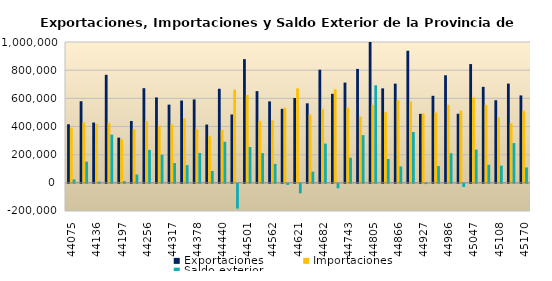
| Category | Exportaciones | Importaciones | Saldo exterior |
|---|---|---|---|
| 2020-09-01 | 415851.9 | 391765.11 | 24086.79 |
| 2020-10-01 | 579330.62 | 429257.84 | 150072.78 |
| 2020-11-01 | 428116.983 | 418885.529 | 9231.454 |
| 2020-12-01 | 766984.753 | 424753.82 | 342230.933 |
| 2021-01-01 | 321034.51 | 309401.55 | 11632.96 |
| 2021-02-01 | 439118.25 | 380078.53 | 59039.72 |
| 2021-03-01 | 672033.91 | 438109.5 | 233924.41 |
| 2021-04-01 | 606425.01 | 406580.73 | 199844.28 |
| 2021-05-01 | 555191.59 | 414958.96 | 140232.63 |
| 2021-06-01 | 584517.86 | 458749.69 | 125768.17 |
| 2021-07-01 | 592215.46 | 380627.08 | 211588.38 |
| 2021-08-01 | 413833.07 | 329895.94 | 83937.13 |
| 2021-09-01 | 667860.28 | 376602.79 | 291257.49 |
| 2021-10-01 | 485511.53 | 661520.46 | -176008.93 |
| 2021-11-01 | 878182.96 | 623772.34 | 254410.62 |
| 2021-12-01 | 651099.404 | 440022.513 | 211076.891 |
| 2022-01-01 | 578231.872 | 443547.062 | 134684.81 |
| 2022-02-01 | 525546.083 | 533306.789 | -7760.706 |
| 2022-03-01 | 602474.187 | 670231.521 | -67757.334 |
| 2022-04-01 | 564566.111 | 485418.348 | 79147.763 |
| 2022-05-01 | 803329.469 | 524697.141 | 278632.328 |
| 2022-06-01 | 632182.316 | 664140.82 | -31958.504 |
| 2022-07-01 | 711919.091 | 533469.032 | 178450.06 |
| 2022-08-01 | 808936.658 | 470305.866 | 338630.792 |
| 2022-09-01 | 1246269.653 | 553362.196 | 692907.456 |
| 2022-10-01 | 670788.005 | 501262.217 | 169525.788 |
| 2022-11-01 | 704215.36 | 587583.902 | 116631.458 |
| 2022-12-01 | 938097.978 | 577341.702 | 360756.275 |
| 2023-01-01 | 489684.135 | 491778.698 | -2094.564 |
| 2023-02-01 | 618021.806 | 498976.336 | 119045.469 |
| 2023-03-01 | 763721.131 | 553855.733 | 209865.398 |
| 2023-04-01 | 490467.833 | 512326.009 | -21858.176 |
| 2023-05-01 | 843311.598 | 607316.839 | 235994.759 |
| 2023-06-01 | 681562.258 | 553686.761 | 127875.497 |
| 2023-07-01 | 586592.508 | 464822.429 | 121770.078 |
| 2023-08-01 | 704756.206 | 422340.098 | 282416.108 |
| 2023-09-01 | 620653.169 | 511392.925 | 109260.245 |